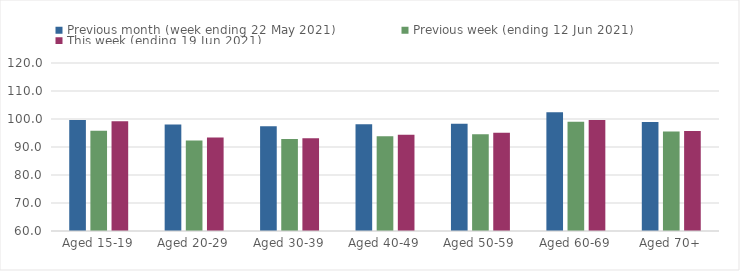
| Category | Previous month (week ending 22 May 2021) | Previous week (ending 12 Jun 2021) | This week (ending 19 Jun 2021) |
|---|---|---|---|
| Aged 15-19 | 99.65 | 95.81 | 99.2 |
| Aged 20-29 | 98 | 92.29 | 93.37 |
| Aged 30-39 | 97.43 | 92.85 | 93.16 |
| Aged 40-49 | 98.14 | 93.87 | 94.35 |
| Aged 50-59 | 98.26 | 94.57 | 95.06 |
| Aged 60-69 | 102.44 | 99.05 | 99.6 |
| Aged 70+ | 98.96 | 95.5 | 95.72 |